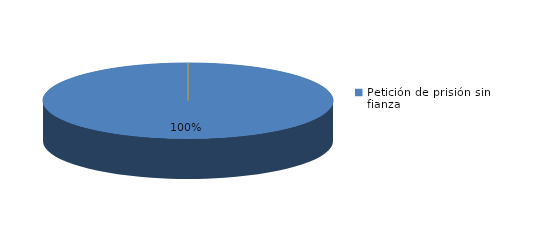
| Category | Series 0 |
|---|---|
| Petición de prisión sin fianza | 68 |
| Peticion de libertad con fianza | 0 |
| Petición de libertad | 0 |